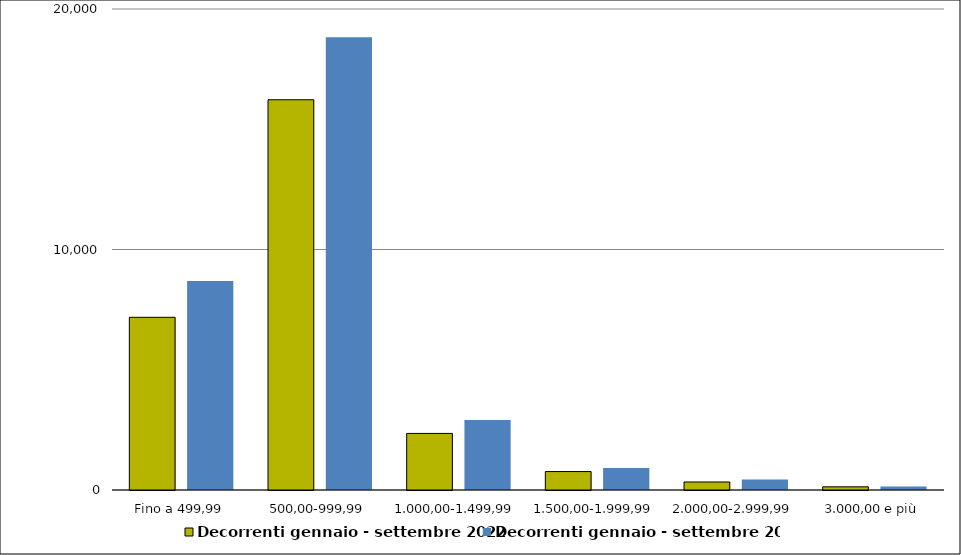
| Category | Decorrenti gennaio - settembre 2022 | Decorrenti gennaio - settembre 2021 |
|---|---|---|
| Fino a 499,99 | 7181 | 8693 |
| 500,00-999,99 | 16226 | 18828 |
| 1.000,00-1.499,99 | 2353 | 2909 |
| 1.500,00-1.999,99 | 767 | 918 |
| 2.000,00-2.999,99 | 333 | 435 |
| 3.000,00 e più | 132 | 145 |